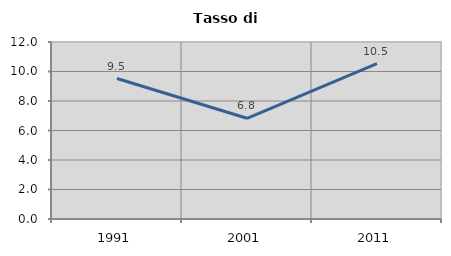
| Category | Tasso di disoccupazione   |
|---|---|
| 1991.0 | 9.524 |
| 2001.0 | 6.829 |
| 2011.0 | 10.526 |